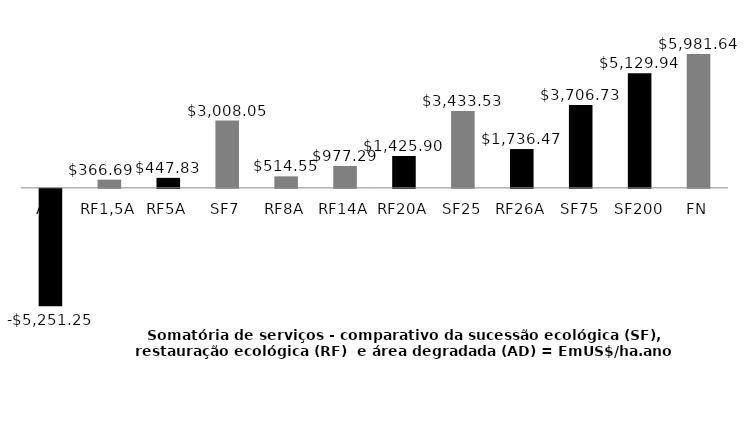
| Category | Series 0 |
|---|---|
| AD | -5251.25 |
| RF1,5A | 366.69 |
| RF5A | 447.831 |
| SF7 | 3008.05 |
| RF8A | 514.551 |
| RF14A | 977.287 |
| RF20A | 1425.903 |
| SF25 | 3433.53 |
| RF26A | 1736.475 |
| SF75 | 3706.73 |
| SF200 | 5129.94 |
| FN | 5981.644 |